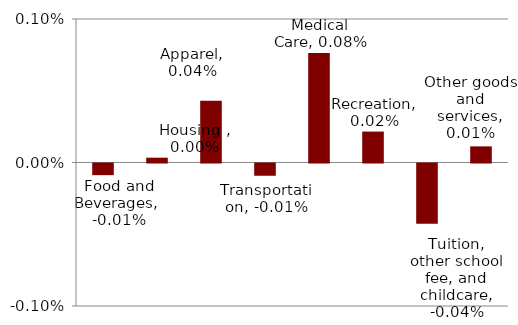
| Category | 1993-2014 |
|---|---|
| Food and Beverages | 0 |
| Housing  | 0 |
| Apparel | 0 |
| Transportation | 0 |
| Medical Care | 0.001 |
| Recreation | 0 |
| Tuition, other school fee, and childcare | 0 |
| Other goods and services | 0 |